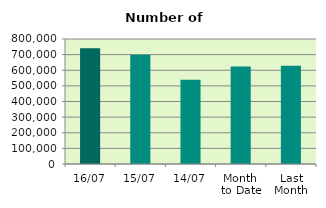
| Category | Series 0 |
|---|---|
| 16/07 | 740722 |
| 15/07 | 699746 |
| 14/07 | 538404 |
| Month 
to Date | 624037.667 |
| Last
Month | 628899 |